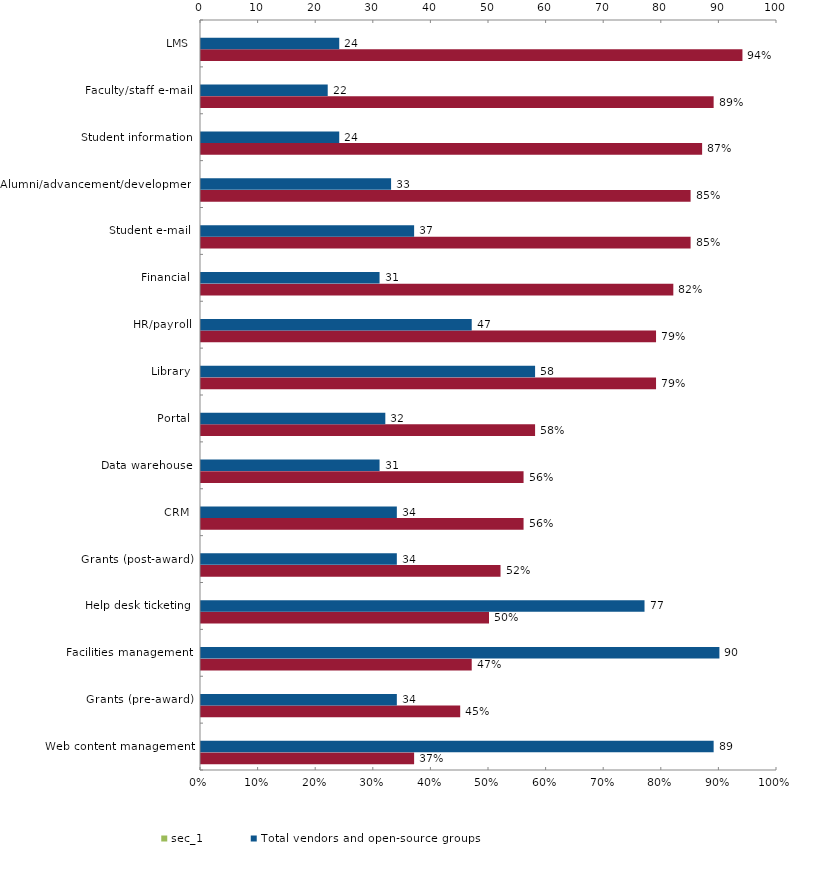
| Category | Percentage of market owned by top-five providers | pri_2 | sec_1 |
|---|---|---|---|
| Web content management | 0.37 | 0 | 0 |
| Grants (pre-award) | 0.45 | 0 | 0 |
| Facilities management | 0.47 | 0 | 0 |
| Help desk ticketing | 0.5 | 0 | 0 |
| Grants (post-award) | 0.52 | 0 | 0 |
| CRM | 0.56 | 0 | 0 |
| Data warehouse | 0.56 | 0 | 0 |
| Portal | 0.58 | 0 | 0 |
| Library | 0.79 | 0 | 0 |
| HR/payroll | 0.79 | 0 | 0 |
| Financial | 0.82 | 0 | 0 |
| Student e-mail | 0.85 | 0 | 0 |
| Alumni/advancement/development | 0.85 | 0 | 0 |
| Student information | 0.87 | 0 | 0 |
| Faculty/staff e-mail | 0.89 | 0 | 0 |
| LMS | 0.94 | 0 | 0 |